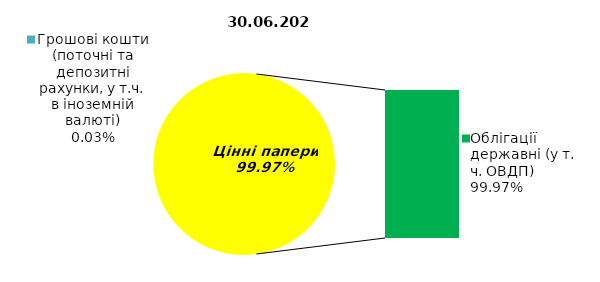
| Category | Series 0 |
|---|---|
| Грошові кошти (поточні та депозитні рахунки, у т.ч. в іноземній валюті) | 0.044 |
| Банківські метали | 0 |
| Нерухомість | 0 |
| Інші активи | 0 |
| Акції | 0 |
| Облігації підприємств | 0 |
| Муніципальні облігації | 0 |
| Облігації державні (у т. ч. ОВДП) | 176.191 |
| Іпотечні сертифікати | 0 |